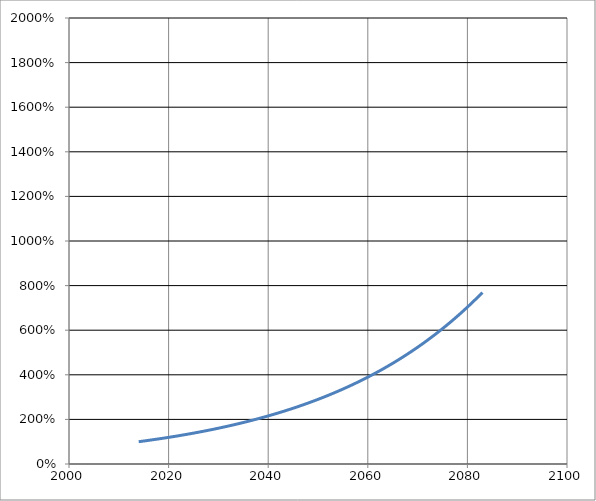
| Category | Series 0 |
|---|---|
| 2014.0 | 1 |
| 2015.0 | 1.03 |
| 2016.0 | 1.061 |
| 2017.0 | 1.093 |
| 2018.0 | 1.126 |
| 2019.0 | 1.159 |
| 2020.0 | 1.194 |
| 2021.0 | 1.23 |
| 2022.0 | 1.267 |
| 2023.0 | 1.305 |
| 2024.0 | 1.344 |
| 2025.0 | 1.384 |
| 2026.0 | 1.426 |
| 2027.0 | 1.469 |
| 2028.0 | 1.513 |
| 2029.0 | 1.558 |
| 2030.0 | 1.605 |
| 2031.0 | 1.653 |
| 2032.0 | 1.702 |
| 2033.0 | 1.754 |
| 2034.0 | 1.806 |
| 2035.0 | 1.86 |
| 2036.0 | 1.916 |
| 2037.0 | 1.974 |
| 2038.0 | 2.033 |
| 2039.0 | 2.094 |
| 2040.0 | 2.157 |
| 2041.0 | 2.221 |
| 2042.0 | 2.288 |
| 2043.0 | 2.357 |
| 2044.0 | 2.427 |
| 2045.0 | 2.5 |
| 2046.0 | 2.575 |
| 2047.0 | 2.652 |
| 2048.0 | 2.732 |
| 2049.0 | 2.814 |
| 2050.0 | 2.898 |
| 2051.0 | 2.985 |
| 2052.0 | 3.075 |
| 2053.0 | 3.167 |
| 2054.0 | 3.262 |
| 2055.0 | 3.36 |
| 2056.0 | 3.461 |
| 2057.0 | 3.565 |
| 2058.0 | 3.671 |
| 2059.0 | 3.782 |
| 2060.0 | 3.895 |
| 2061.0 | 4.012 |
| 2062.0 | 4.132 |
| 2063.0 | 4.256 |
| 2064.0 | 4.384 |
| 2065.0 | 4.515 |
| 2066.0 | 4.651 |
| 2067.0 | 4.79 |
| 2068.0 | 4.934 |
| 2069.0 | 5.082 |
| 2070.0 | 5.235 |
| 2071.0 | 5.392 |
| 2072.0 | 5.553 |
| 2073.0 | 5.72 |
| 2074.0 | 5.892 |
| 2075.0 | 6.068 |
| 2076.0 | 6.25 |
| 2077.0 | 6.438 |
| 2078.0 | 6.631 |
| 2079.0 | 6.83 |
| 2080.0 | 7.035 |
| 2081.0 | 7.246 |
| 2082.0 | 7.463 |
| 2083.0 | 7.687 |